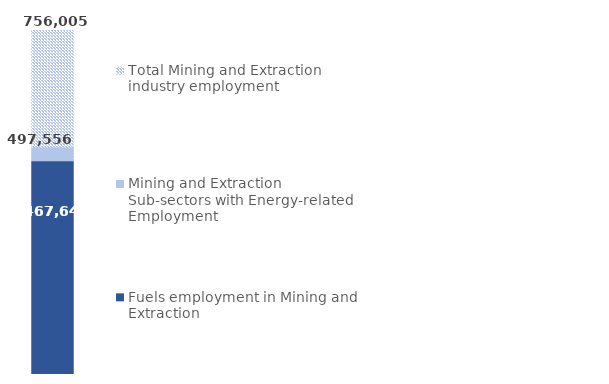
| Category | Total Mining and Extraction industry employment | Mining and Extraction Sub-sectors with Energy-related Employment | Fuels employment in Mining and Extraction |
|---|---|---|---|
| Mining and Extraction | 756005 | 497556 | 467647.513 |